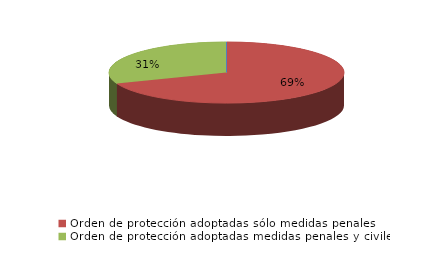
| Category | Series 0 |
|---|---|
| Orden de protección denegadas | 0 |
| Orden de protección adoptadas sólo medidas penales | 47 |
| Orden de protección adoptadas medidas penales y civiles | 21 |